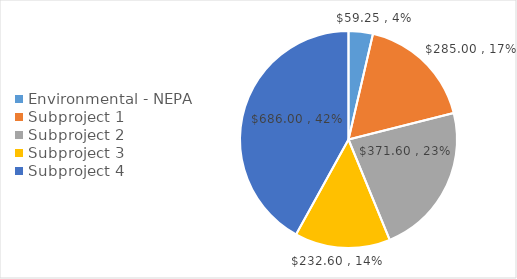
| Category | Series 0 |
|---|---|
| Environmental - NEPA | 59.25 |
| Subproject 1 | 285 |
| Subproject 2 | 371.6 |
| Subproject 3 | 232.6 |
| Subproject 4 | 686 |